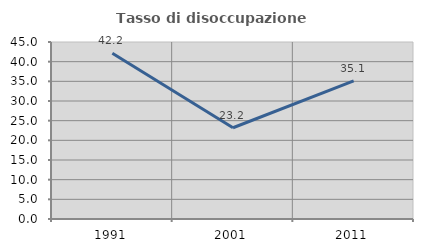
| Category | Tasso di disoccupazione giovanile  |
|---|---|
| 1991.0 | 42.165 |
| 2001.0 | 23.195 |
| 2011.0 | 35.134 |